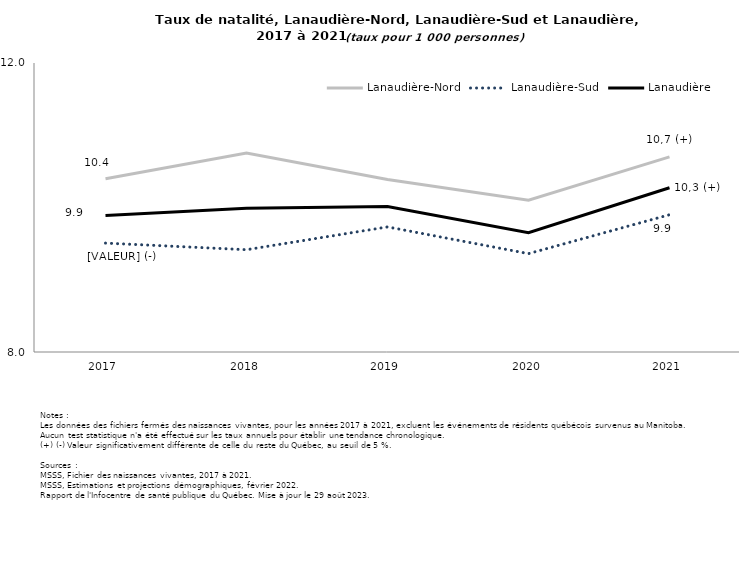
| Category | Lanaudière-Nord | Lanaudière-Sud | Lanaudière |
|---|---|---|---|
| 2017.0 | 10.399 | 9.507 | 9.889 |
| 2018.0 | 10.753 | 9.416 | 9.989 |
| 2019.0 | 10.389 | 9.731 | 10.013 |
| 2020.0 | 10.1 | 9.361 | 9.65 |
| 2021.0 | 10.7 | 9.9 | 10.274 |